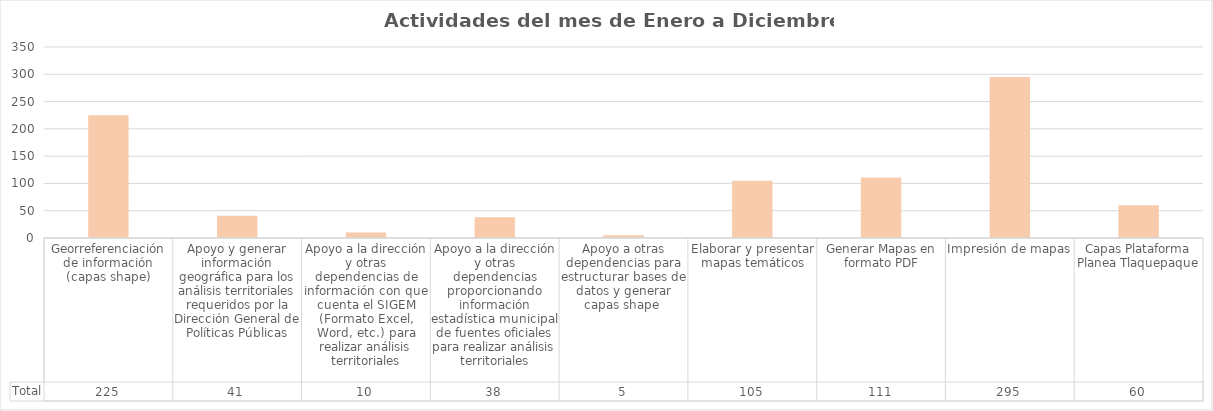
| Category | Total |
|---|---|
| Georreferenciación de información (capas shape) | 225 |
| Apoyo y generar información geográfica para los análisis territoriales requeridos por la Dirección General de Políticas Públicas | 41 |
| Apoyo a la dirección y otras dependencias de información con que cuenta el SIGEM (Formato Excel, Word, etc.) para realizar análisis territoriales | 10 |
| Apoyo a la dirección y otras dependencias proporcionando información estadística municipal de fuentes oficiales para realizar análisis territoriales | 38 |
| Apoyo a otras dependencias para estructurar bases de datos y generar capas shape  | 5 |
| Elaborar y presentar mapas temáticos | 105 |
| Generar Mapas en formato PDF | 111 |
| Impresión de mapas | 295 |
| Capas Plataforma Planea Tlaquepaque | 60 |